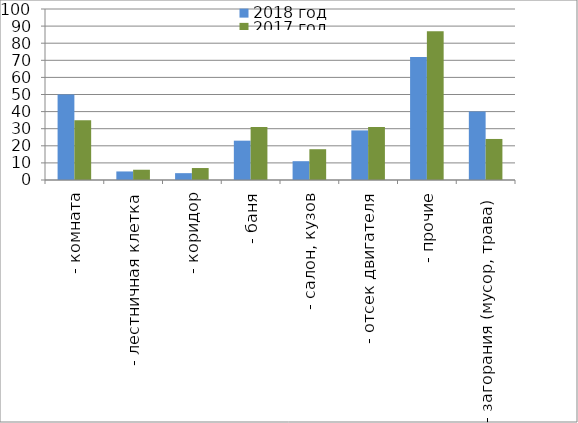
| Category | 2018 год | 2017 год |
|---|---|---|
|  - комната | 50 | 35 |
|  - лестничная клетка | 5 | 6 |
|  - коридор | 4 | 7 |
|  - баня | 23 | 31 |
|  - салон, кузов | 11 | 18 |
|  - отсек двигателя | 29 | 31 |
| - прочие | 72 | 87 |
| - загорания (мусор, трава)  | 40 | 24 |